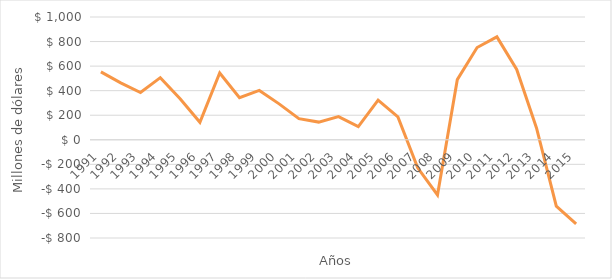
| Category | Balanza Comercial Colombia 
(Precio CIF, US$ millones) |
|---|---|
| 1991.0 | 553.124 |
| 1992.0 | 463.571 |
| 1993.0 | 384.58 |
| 1994.0 | 506.049 |
| 1995.0 | 333.704 |
| 1996.0 | 142.23 |
| 1997.0 | 543.516 |
| 1998.0 | 343.45 |
| 1999.0 | 401.982 |
| 2000.0 | 292.649 |
| 2001.0 | 171.905 |
| 2002.0 | 144.008 |
| 2003.0 | 188.753 |
| 2004.0 | 106.86 |
| 2005.0 | 322.418 |
| 2006.0 | 186.056 |
| 2007.0 | -228.099 |
| 2008.0 | -448.803 |
| 2009.0 | 489.944 |
| 2010.0 | 751.469 |
| 2011.0 | 838.28 |
| 2012.0 | 572.871 |
| 2013.0 | 96.486 |
| 2014.0 | -541.104 |
| 2015.0 | -685.328 |